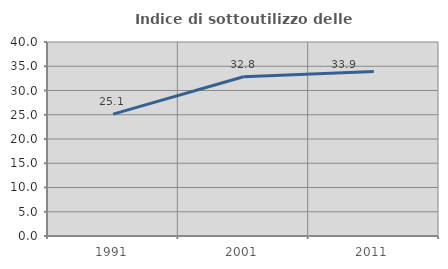
| Category | Indice di sottoutilizzo delle abitazioni  |
|---|---|
| 1991.0 | 25.134 |
| 2001.0 | 32.828 |
| 2011.0 | 33.906 |